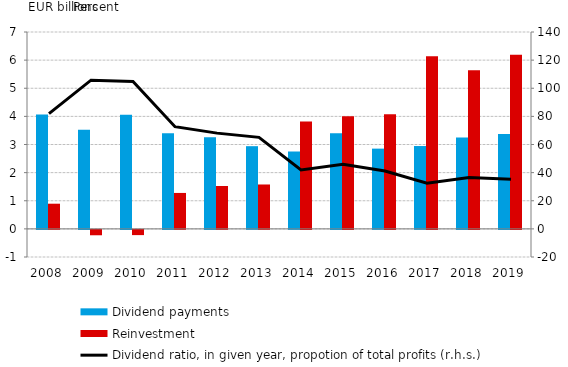
| Category | Dividend payments | Reinvestment |
|---|---|---|
| 2008.0 | 4.064 | 0.895 |
| 2009.0 | 3.522 | -0.192 |
| 2010.0 | 4.061 | -0.186 |
| 2011.0 | 3.399 | 1.278 |
| 2012.0 | 3.253 | 1.525 |
| 2013.0 | 2.94 | 1.578 |
| 2014.0 | 2.751 | 3.816 |
| 2015.0 | 3.396 | 4.002 |
| 2016.0 | 2.853 | 4.073 |
| 2017.0 | 2.946 | 6.137 |
| 2018.0 | 3.245 | 5.641 |
| 2019.0 | 3.375 | 6.189 |